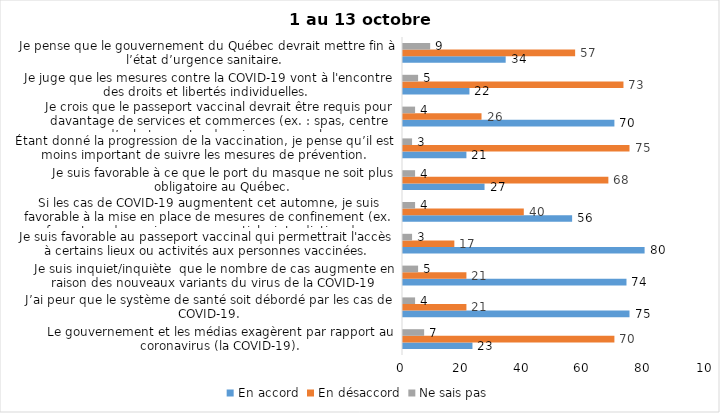
| Category | En accord | En désaccord | Ne sais pas |
|---|---|---|---|
| Le gouvernement et les médias exagèrent par rapport au coronavirus (la COVID-19). | 23 | 70 | 7 |
| J’ai peur que le système de santé soit débordé par les cas de COVID-19. | 75 | 21 | 4 |
| Je suis inquiet/inquiète  que le nombre de cas augmente en raison des nouveaux variants du virus de la COVID-19 | 74 | 21 | 5 |
| Je suis favorable au passeport vaccinal qui permettrait l'accès à certains lieux ou activités aux personnes vaccinées. | 80 | 17 | 3 |
| Si les cas de COVID-19 augmentent cet automne, je suis favorable à la mise en place de mesures de confinement (ex. fermeture de services non essentiels, interdiction des rassemblements privés) | 56 | 40 | 4 |
| Je suis favorable à ce que le port du masque ne soit plus obligatoire au Québec. | 27 | 68 | 4 |
| Étant donné la progression de la vaccination, je pense qu’il est moins important de suivre les mesures de prévention. | 21 | 75 | 3 |
| Je crois que le passeport vaccinal devrait être requis pour davantage de services et commerces (ex. : spas, centre d’achats, centre de soins personnels. | 70 | 26 | 4 |
| Je juge que les mesures contre la COVID-19 vont à l'encontre des droits et libertés individuelles.  | 22 | 73 | 5 |
| Je pense que le gouvernement du Québec devrait mettre fin à l’état d’urgence sanitaire.  | 34 | 57 | 9 |